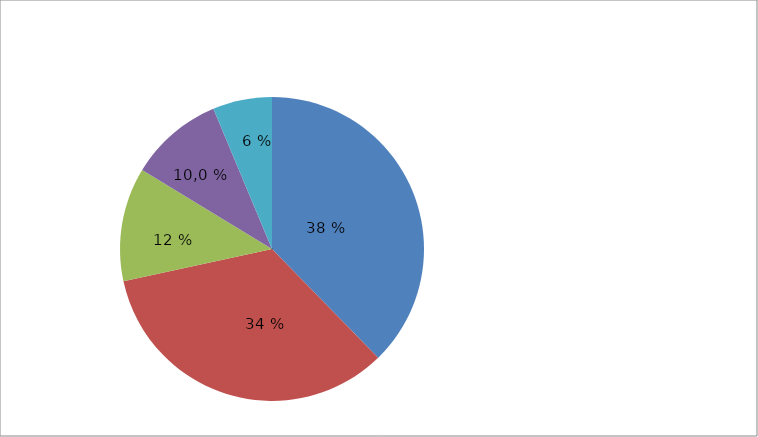
| Category | Series 0 |
|---|---|
| Ingenieurwesen | 37.7 |
| Wirtschaftswissenschaften | 33.9 |
| Informatik | 12.1 |
| Sozialwesen, Erziehung, Gesundheit, Pflege | 10 |
| Sonstige | 6.3 |